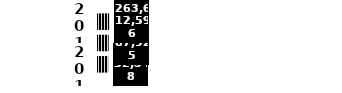
| Category | Series 0 |
|---|---|
| 2010.0 | 258552348 |
| 2011.0 | 261087925 |
| 2012.0 | 263612596 |